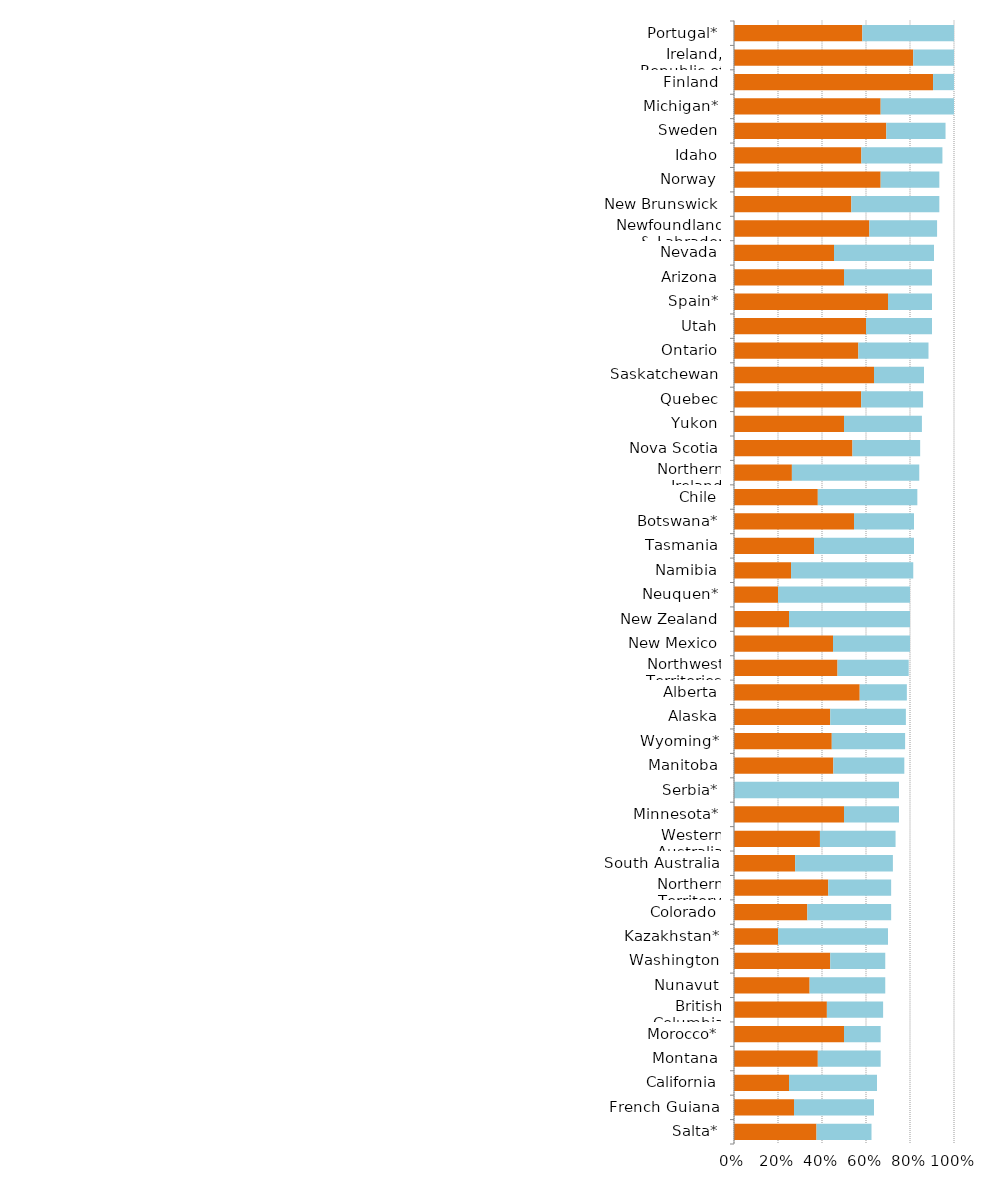
| Category | Series 0 | Series 1 |
|---|---|---|
| Salta* | 0.375 | 0.25 |
| French Guiana | 0.273 | 0.364 |
| California | 0.25 | 0.4 |
| Montana | 0.381 | 0.286 |
| Morocco* | 0.5 | 0.167 |
| British Columbia | 0.422 | 0.256 |
| Nunavut | 0.344 | 0.344 |
| Washington | 0.438 | 0.25 |
| Kazakhstan* | 0.2 | 0.5 |
| Colorado | 0.333 | 0.381 |
| Northern Territory | 0.429 | 0.286 |
| South Australia | 0.278 | 0.444 |
| Western Australia | 0.391 | 0.344 |
| Minnesota* | 0.5 | 0.25 |
| Serbia* | 0 | 0.75 |
| Manitoba | 0.452 | 0.323 |
| Wyoming* | 0.444 | 0.333 |
| Alaska | 0.438 | 0.344 |
| Alberta | 0.571 | 0.214 |
| Northwest Territories | 0.471 | 0.324 |
| New Mexico | 0.45 | 0.35 |
| New Zealand | 0.25 | 0.55 |
| Neuquen* | 0.2 | 0.6 |
| Namibia | 0.259 | 0.556 |
| Tasmania | 0.364 | 0.455 |
| Botswana* | 0.545 | 0.273 |
| Chile | 0.381 | 0.452 |
| Northern Ireland | 0.263 | 0.579 |
| Nova Scotia | 0.538 | 0.308 |
| Yukon | 0.5 | 0.354 |
| Quebec | 0.578 | 0.281 |
| Saskatchewan | 0.636 | 0.227 |
| Ontario | 0.565 | 0.319 |
| Utah | 0.6 | 0.3 |
| Spain* | 0.7 | 0.2 |
| Arizona | 0.5 | 0.4 |
| Nevada | 0.455 | 0.455 |
| Newfoundland & Labrador | 0.615 | 0.308 |
| New Brunswick | 0.533 | 0.4 |
| Norway | 0.667 | 0.267 |
| Idaho | 0.579 | 0.368 |
| Sweden | 0.692 | 0.269 |
| Michigan* | 0.667 | 0.333 |
| Finland | 0.905 | 0.095 |
| Ireland, Republic of | 0.815 | 0.185 |
| Portugal* | 0.583 | 0.417 |